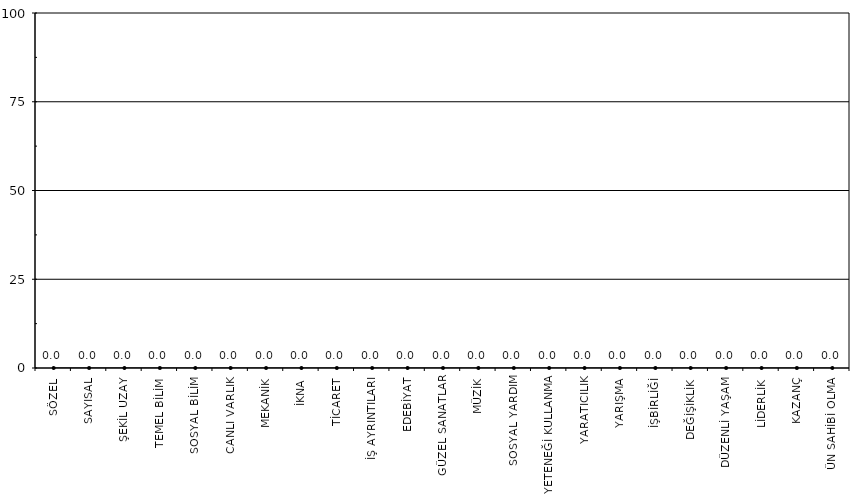
| Category | Series1 | Series4 |
|---|---|---|
| SÖZEL |  | 0 |
| SAYISAL |  | 0 |
| ŞEKİL UZAY |  | 0 |
| TEMEL BİLİM |  | 0 |
| SOSYAL BİLİM |  | 0 |
| CANLI VARLIK |  | 0 |
| MEKANİK |  | 0 |
| İKNA |  | 0 |
| TİCARET |  | 0 |
| İŞ AYRINTILARI |  | 0 |
| EDEBİYAT |  | 0 |
| GÜZEL SANATLAR |  | 0 |
| MÜZİK |  | 0 |
| SOSYAL YARDIM |  | 0 |
| YETENEĞİ KULLANMA |  | 0 |
| YARATICILIK |  | 0 |
| YARIŞMA |  | 0 |
| İŞBİRLİĞİ |  | 0 |
| DEĞİŞİKLİK |  | 0 |
| DÜZENLİ YAŞAM |  | 0 |
| LİDERLİK |  | 0 |
| KAZANÇ |  | 0 |
| ÜN SAHİBİ OLMA |  | 0 |